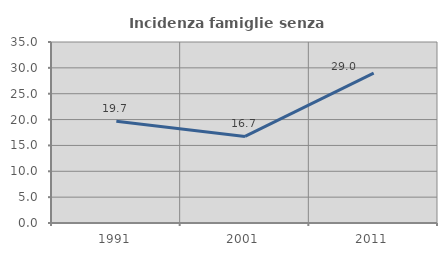
| Category | Incidenza famiglie senza nuclei |
|---|---|
| 1991.0 | 19.689 |
| 2001.0 | 16.748 |
| 2011.0 | 28.976 |